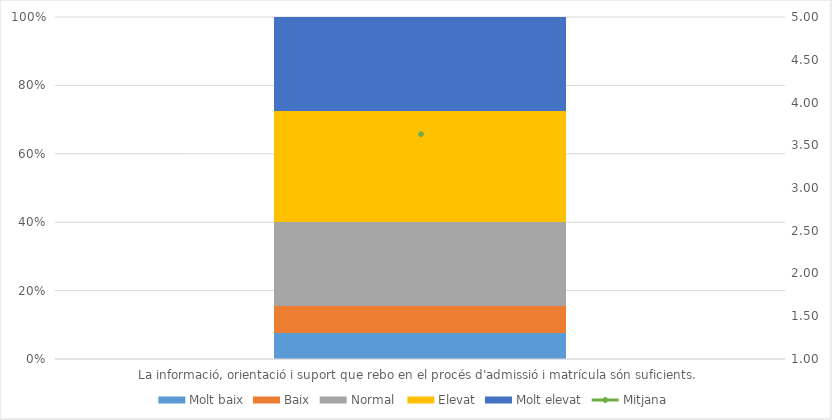
| Category | Molt baix | Baix | Normal  | Elevat | Molt elevat |
|---|---|---|---|---|---|
| La informació, orientació i suport que rebo en el procés d'admissió i matrícula són suficients. | 9 | 9 | 28 | 37 | 31 |